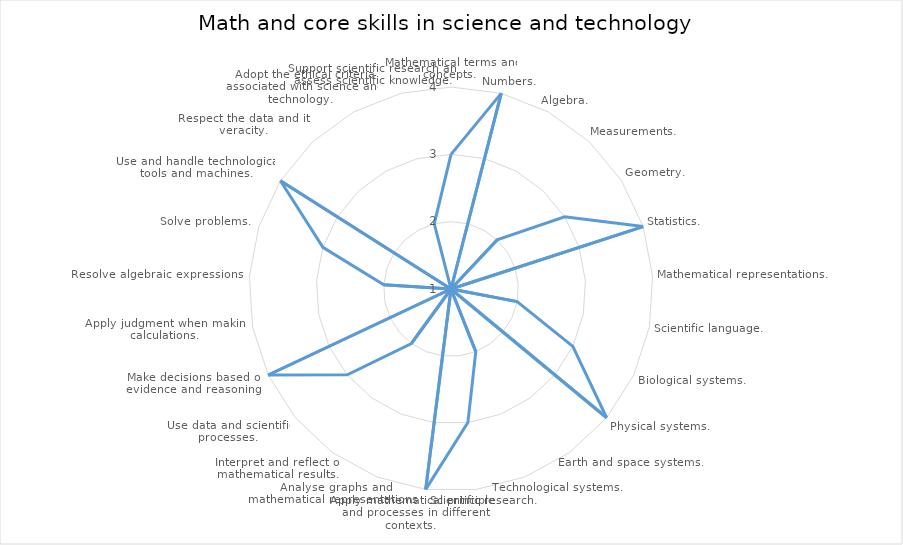
| Category | Series 0 |
|---|---|
| Mathematical terms and concepts.  | 3 |
| Numbers.  | 4 |
| Algebra.  | 1 |
| Measurements.  | 2 |
| Geometry.  | 3 |
| Statistics.  | 4 |
| Mathematical representations.  | 1 |
| Scientific language.  | 2 |
| Biological systems.  | 3 |
| Physical systems.  | 4 |
| Earth and space systems.  | 1 |
| Technological systems.  | 2 |
| Scientific research.  | 3 |
| Apply mathematical principles and processes in different contexts.  | 4 |
| Analyse graphs and mathematical representations.  | 1 |
| Interpret and reflect on mathematical results.  | 2 |
| Use data and scientific processes.  | 3 |
| Make decisions based on evidence and reasoning.  | 4 |
| Apply judgment when making calculations.  | 1 |
| Resolve algebraic expressions.  | 2 |
| Solve problems.  | 3 |
| Use and handle technological tools and machines.  | 4 |
| Respect the data and its veracity.  | 1 |
| Adopt the ethical criteria associated with science and technology.  | 1 |
| Support scientific research and assess scientific knowledge.  | 2 |